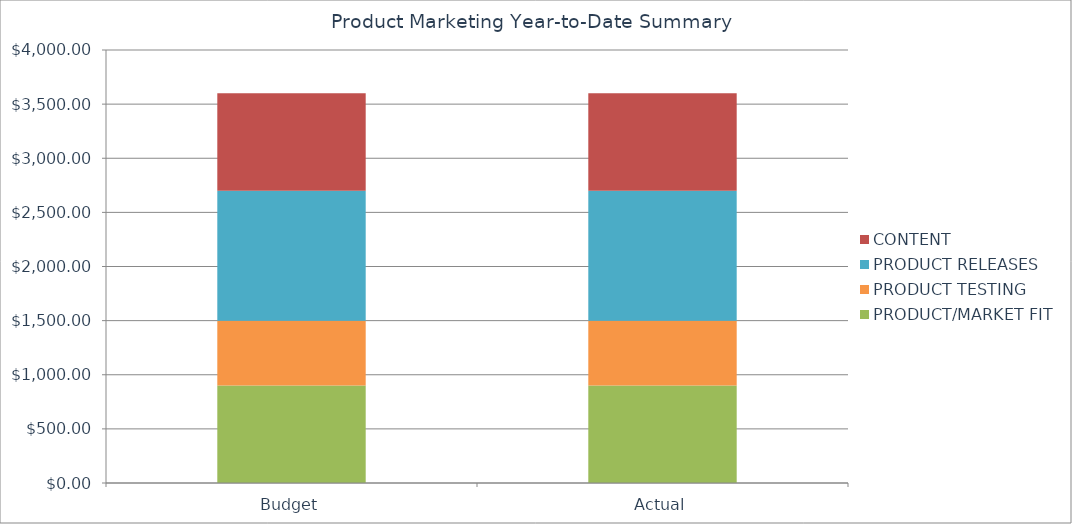
| Category | PRODUCT/MARKET FIT | PRODUCT TESTING | PRODUCT RELEASES | CONTENT |
|---|---|---|---|---|
| Budget | 900 | 600 | 1200 | 900 |
| Actual | 900 | 600 | 1200 | 900 |